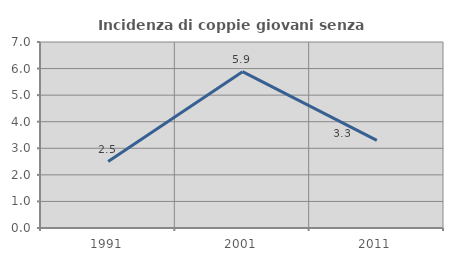
| Category | Incidenza di coppie giovani senza figli |
|---|---|
| 1991.0 | 2.5 |
| 2001.0 | 5.882 |
| 2011.0 | 3.297 |